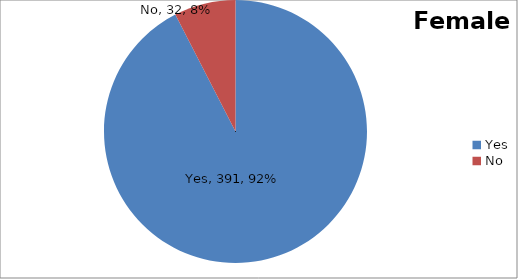
| Category | Series 0 |
|---|---|
| Yes | 391 |
| No | 32 |